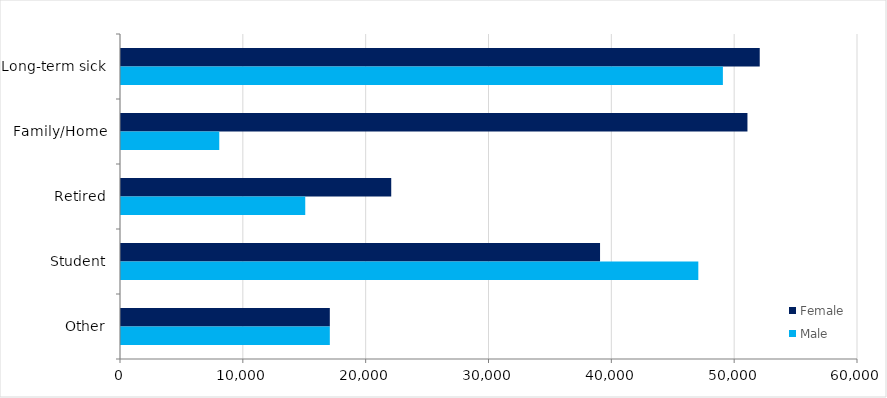
| Category | Female | Male |
|---|---|---|
| Long-term sick | 52000 | 49000 |
| Family/Home | 51000 | 8000 |
| Retired | 22000 | 15000 |
| Student | 39000 | 47000 |
| Other | 17000 | 17000 |